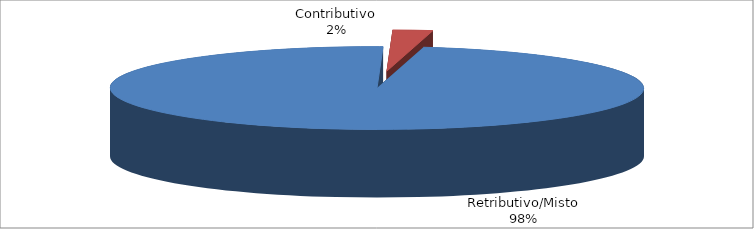
| Category | Series 1 |
|---|---|
| Retributivo/Misto | 40709 |
| Contributivo | 1008 |